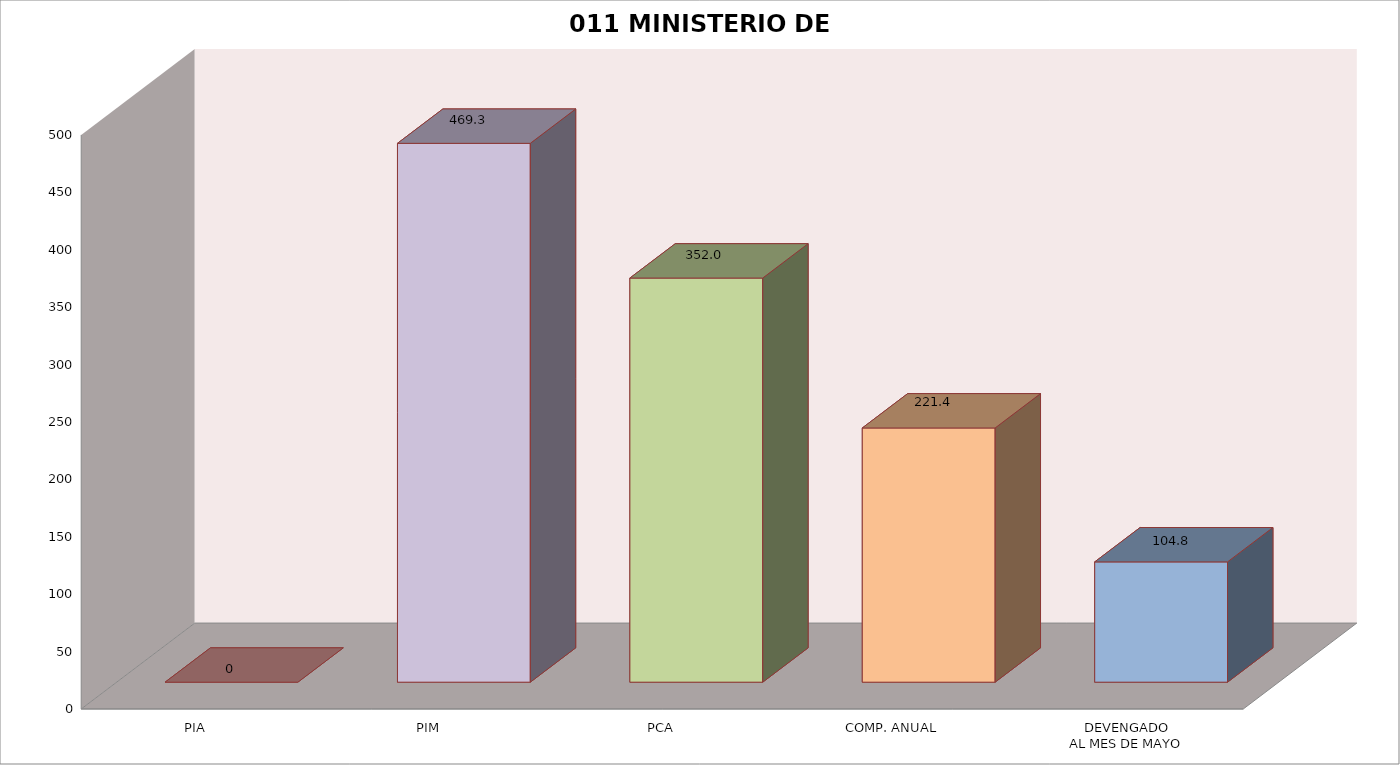
| Category | 011 MINISTERIO DE SALUD |
|---|---|
| PIA | 0 |
| PIM | 469.324 |
| PCA | 351.993 |
| COMP. ANUAL | 221.409 |
| DEVENGADO
AL MES DE MAYO
 | 104.764 |